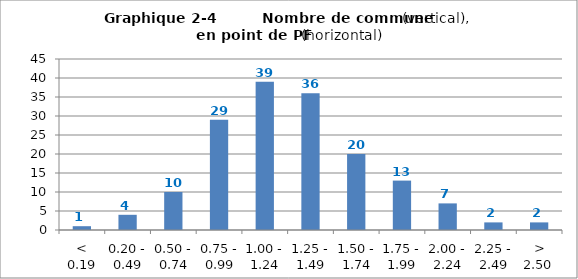
| Category | en point de PF |
|---|---|
| < 0.19 | 1 |
| 0.20 - 0.49 | 4 |
| 0.50 - 0.74 | 10 |
| 0.75 - 0.99 | 29 |
| 1.00 - 1.24 | 39 |
| 1.25 - 1.49 | 36 |
| 1.50 - 1.74 | 20 |
| 1.75 - 1.99 | 13 |
| 2.00 - 2.24 | 7 |
| 2.25 - 2.49 | 2 |
| > 2.50  | 2 |